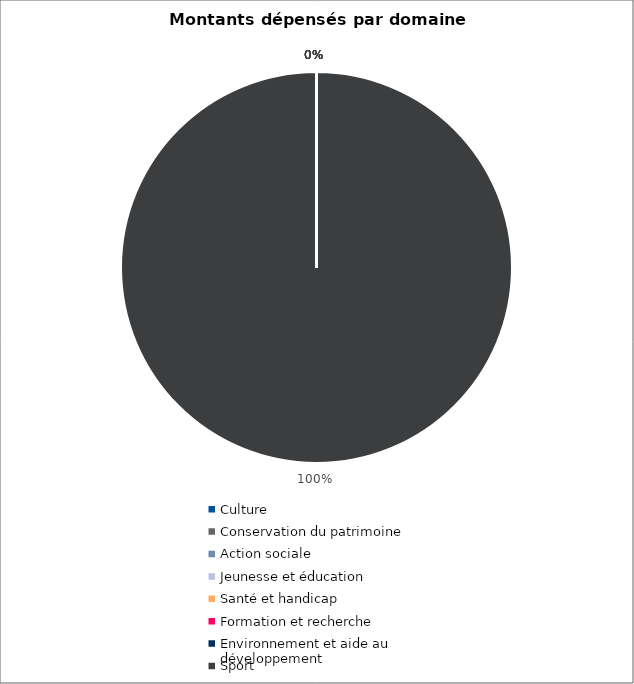
| Category | Series 0 |
|---|---|
| Culture | 0 |
| Conservation du patrimoine | 0 |
| Action sociale | 0 |
| Jeunesse et éducation | 0 |
| Santé et handicap | 0 |
| Formation et recherche | 0 |
| Environnement et aide au
développement | 0 |
| Sport | 484937.45 |
| Autres projets d’utilité publique | 0 |